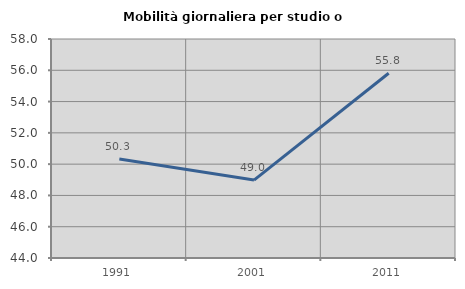
| Category | Mobilità giornaliera per studio o lavoro |
|---|---|
| 1991.0 | 50.327 |
| 2001.0 | 48.98 |
| 2011.0 | 55.809 |